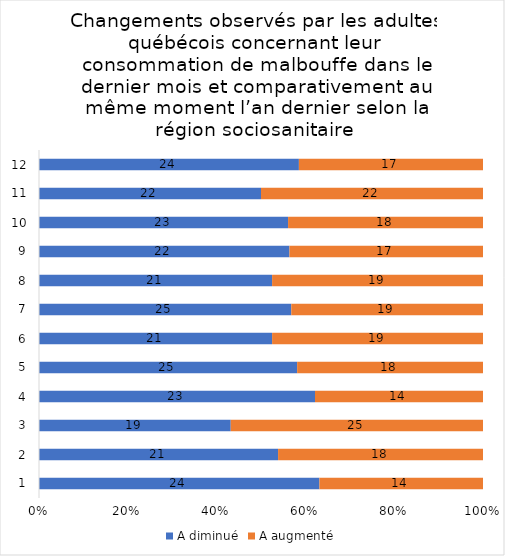
| Category | A diminué | A augmenté |
|---|---|---|
| 0 | 24 | 14 |
| 1 | 21 | 18 |
| 2 | 19 | 25 |
| 3 | 23 | 14 |
| 4 | 25 | 18 |
| 5 | 21 | 19 |
| 6 | 25 | 19 |
| 7 | 21 | 19 |
| 8 | 22 | 17 |
| 9 | 23 | 18 |
| 10 | 22 | 22 |
| 11 | 24 | 17 |